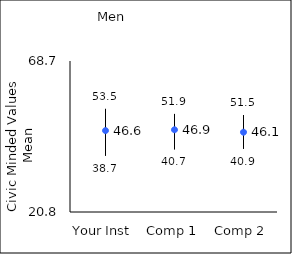
| Category | 25th percentile | 75th percentile | Mean |
|---|---|---|---|
| Your Inst | 38.7 | 53.5 | 46.62 |
| Comp 1 | 40.7 | 51.9 | 46.89 |
| Comp 2 | 40.9 | 51.5 | 46.11 |